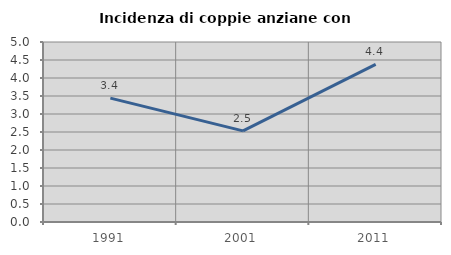
| Category | Incidenza di coppie anziane con figli |
|---|---|
| 1991.0 | 3.441 |
| 2001.0 | 2.532 |
| 2011.0 | 4.38 |